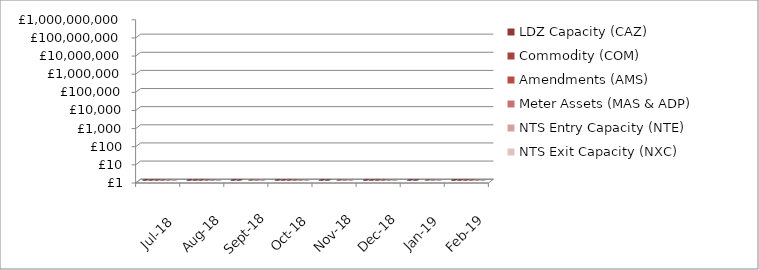
| Category | LDZ Capacity (CAZ) | Commodity (COM) | Amendments (AMS) | Meter Assets (MAS & ADP) | NTS Entry Capacity (NTE) | NTS Exit Capacity (NXC) |
|---|---|---|---|---|---|---|
| 2018-07-01 | 312562745.62 | 14290600.7 | 1483244.96 | 200707.69 | 1735803.71 | 18720256.49 |
| 2018-08-01 | 312780813.69 | 15048321.28 | 830443.17 | 200263.88 | 1735803.71 | 18720256.49 |
| 2018-09-01 | 302866760.19 | 17528307.3 | -385853.99 | 189788.22 | 1760935.51 | 18113875.74 |
| 2018-10-01 | 313359948.83 | 29476349.27 | 58182.64 | 196114.17 | 8332609.71 | 13807265.85 |
| 2018-11-01 | 303715362.33 | 37862420.69 | -765656.96 | 189786.88 | 8064487.69 | 13789980.96 |
| 2018-12-01 | 309858247 | 42951905.58 | 374357.97 | 196114.66 | 8796213.72 | 13770471.59 |
| 2019-01-01 | 310573206.23 | 52085770.33 | -1327183.91 | 196114.87 | 10143131.93 | 13947987.58 |
| 2019-02-01 | 280690666.66 | 40096892.48 | 245268.62 | 177134.91 | 9130603.41 | 12803012.32 |